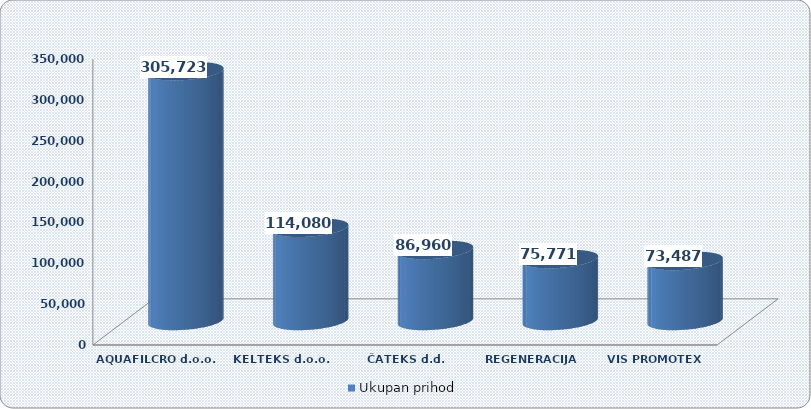
| Category | Ukupan prihod |
|---|---|
| AQUAFILCRO d.o.o. | 305723.472 |
| KELTEKS d.o.o. | 114079.583 |
| ČATEKS d.d. | 86960.096 |
| REGENERACIJA d.o.o. | 75770.574 |
| VIS PROMOTEX | 73486.939 |